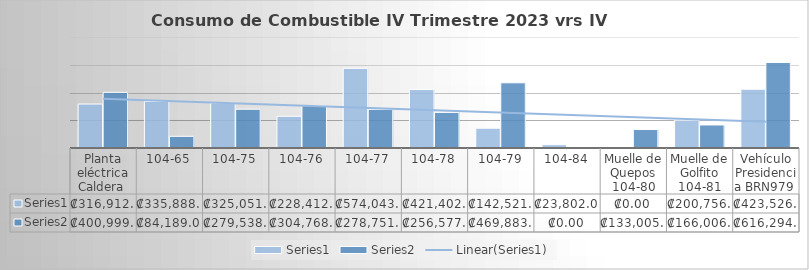
| Category | Series 0 | Series 1 |
|---|---|---|
| Planta eléctrica Caldera  | 316912 | 400999 |
| 104-65 | 335888 | 84189 |
| 104-75 | 325051 | 279538 |
| 104-76 | 228412 | 304768 |
| 104-77 | 574043 | 278751 |
| 104-78 | 421402.65 | 256577 |
| 104-79 | 142521 | 469883 |
| 104-84 | 23802 | 0 |
| Muelle de Quepos 104-80 | 0 | 133005 |
| Muelle de Golfito 104-81 | 200756 | 166006 |
| Vehículo Presidencia BRN979  | 423526 | 616294.1 |